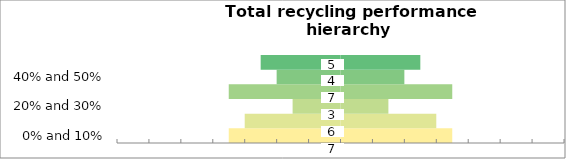
| Category | Series 0 | Series 1 |
|---|---|---|
| 0% and 10% | -3.5 | 3.5 |
| 10% and 20% | -3 | 3 |
| 20% and 30% | -1.5 | 1.5 |
| 30% and 40% | -3.5 | 3.5 |
| 40% and 50% | -2 | 2 |
| 50% and 100% | -2.5 | 2.5 |